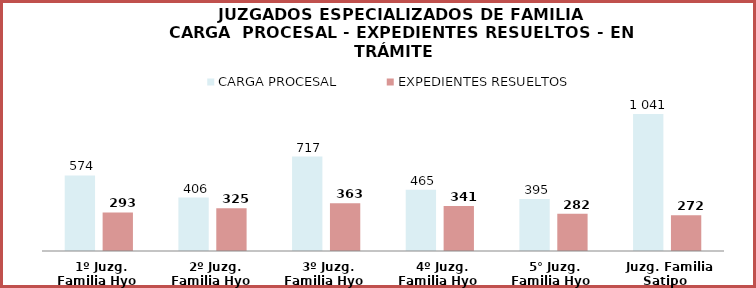
| Category | CARGA PROCESAL | EXPEDIENTES RESUELTOS |
|---|---|---|
| 1º Juzg. Familia Hyo | 574 | 293 |
| 2º Juzg. Familia Hyo | 406 | 325 |
| 3º Juzg. Familia Hyo | 717 | 363 |
| 4º Juzg. Familia Hyo | 465 | 341 |
| 5° Juzg. Familia Hyo | 395 | 282 |
| Juzg. Familia Satipo | 1041 | 272 |